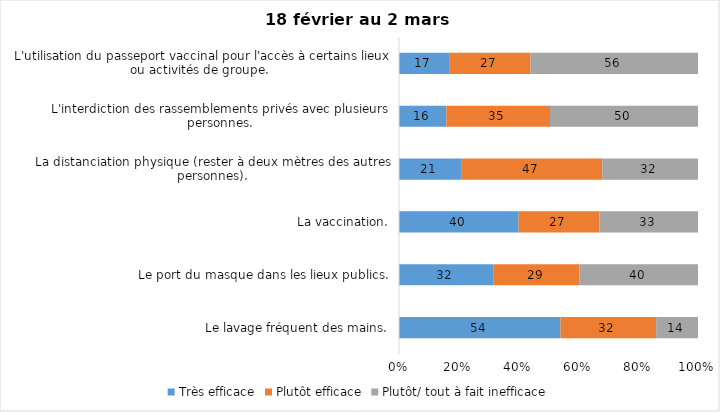
| Category | Très efficace | Plutôt efficace | Plutôt/ tout à fait inefficace |
|---|---|---|---|
| Le lavage fréquent des mains. | 54 | 32 | 14 |
| Le port du masque dans les lieux publics. | 32 | 29 | 40 |
| La vaccination. | 40 | 27 | 33 |
| La distanciation physique (rester à deux mètres des autres personnes). | 21 | 47 | 32 |
| L'interdiction des rassemblements privés avec plusieurs personnes. | 16 | 35 | 50 |
| L'utilisation du passeport vaccinal pour l'accès à certains lieux ou activités de groupe.  | 17 | 27 | 56 |